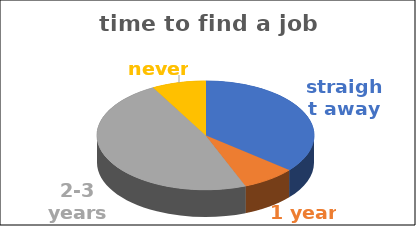
| Category | time to find a job | Series 1 | Series 2 | Series 3 | Series 4 |
|---|---|---|---|---|---|
| straight away | 0.36 |  |  |  |  |
| 1 year | 0.08 |  |  |  |  |
| 2-3 years | 0.48 |  |  |  |  |
| never | 0.08 |  |  |  |  |